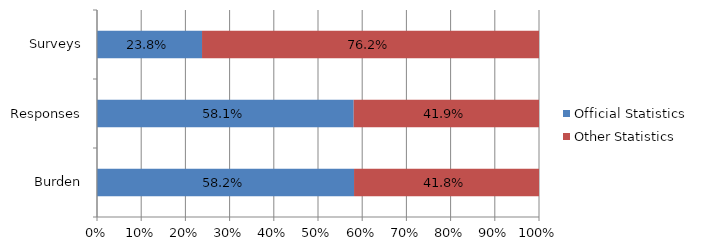
| Category | Official Statistics | Other Statistics |
|---|---|---|
| Burden | 0.582 | 0.418 |
| Responses | 0.581 | 0.419 |
| Surveys | 0.238 | 0.762 |